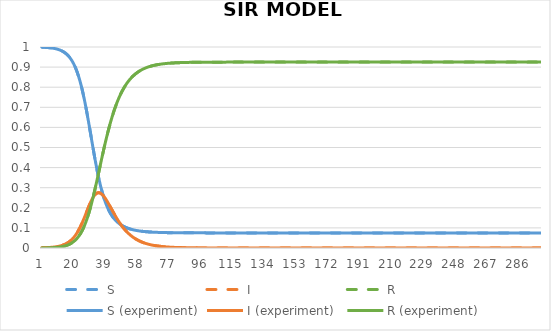
| Category | S | I  | R | S (experiment) | I (experiment) | R (experiment) |
|---|---|---|---|---|---|---|
| 0 | 0.999 | 0.001 | 0 | 0.999 | 0.001 | 0 |
| 1 | 0.999 | 0.001 | 0 | 0.999 | 0.001 | 0 |
| 2 | 0.998 | 0.002 | 0 | 0.998 | 0.002 | 0 |
| 3 | 0.998 | 0.002 | 0.001 | 0.998 | 0.002 | 0.001 |
| 4 | 0.997 | 0.002 | 0.001 | 0.997 | 0.002 | 0.001 |
| 5 | 0.996 | 0.003 | 0.001 | 0.996 | 0.003 | 0.001 |
| 6 | 0.995 | 0.004 | 0.002 | 0.995 | 0.004 | 0.002 |
| 7 | 0.994 | 0.004 | 0.002 | 0.994 | 0.004 | 0.002 |
| 8 | 0.992 | 0.005 | 0.003 | 0.992 | 0.005 | 0.003 |
| 9 | 0.99 | 0.007 | 0.003 | 0.99 | 0.007 | 0.003 |
| 10 | 0.987 | 0.008 | 0.004 | 0.987 | 0.008 | 0.004 |
| 11 | 0.984 | 0.01 | 0.006 | 0.984 | 0.01 | 0.006 |
| 12 | 0.98 | 0.013 | 0.007 | 0.98 | 0.013 | 0.007 |
| 13 | 0.976 | 0.016 | 0.009 | 0.976 | 0.016 | 0.009 |
| 14 | 0.97 | 0.019 | 0.011 | 0.97 | 0.019 | 0.011 |
| 15 | 0.963 | 0.024 | 0.014 | 0.963 | 0.024 | 0.014 |
| 16 | 0.954 | 0.029 | 0.017 | 0.954 | 0.029 | 0.017 |
| 17 | 0.944 | 0.035 | 0.021 | 0.944 | 0.035 | 0.021 |
| 18 | 0.931 | 0.043 | 0.026 | 0.931 | 0.043 | 0.026 |
| 19 | 0.916 | 0.052 | 0.032 | 0.916 | 0.052 | 0.032 |
| 20 | 0.898 | 0.063 | 0.039 | 0.898 | 0.063 | 0.039 |
| 21 | 0.877 | 0.075 | 0.048 | 0.877 | 0.075 | 0.048 |
| 22 | 0.852 | 0.089 | 0.058 | 0.852 | 0.089 | 0.058 |
| 23 | 0.824 | 0.106 | 0.071 | 0.824 | 0.106 | 0.071 |
| 24 | 0.791 | 0.124 | 0.086 | 0.791 | 0.124 | 0.086 |
| 25 | 0.754 | 0.143 | 0.103 | 0.754 | 0.143 | 0.103 |
| 26 | 0.713 | 0.164 | 0.123 | 0.713 | 0.164 | 0.123 |
| 27 | 0.669 | 0.185 | 0.146 | 0.669 | 0.185 | 0.146 |
| 28 | 0.622 | 0.206 | 0.172 | 0.622 | 0.206 | 0.172 |
| 29 | 0.573 | 0.226 | 0.201 | 0.573 | 0.226 | 0.201 |
| 30 | 0.524 | 0.243 | 0.232 | 0.524 | 0.243 | 0.232 |
| 31 | 0.476 | 0.257 | 0.267 | 0.476 | 0.257 | 0.267 |
| 32 | 0.43 | 0.268 | 0.303 | 0.43 | 0.268 | 0.303 |
| 33 | 0.386 | 0.274 | 0.34 | 0.386 | 0.274 | 0.34 |
| 34 | 0.346 | 0.275 | 0.378 | 0.346 | 0.275 | 0.378 |
| 35 | 0.31 | 0.273 | 0.417 | 0.31 | 0.273 | 0.417 |
| 36 | 0.278 | 0.267 | 0.455 | 0.278 | 0.267 | 0.455 |
| 37 | 0.25 | 0.257 | 0.492 | 0.25 | 0.257 | 0.492 |
| 38 | 0.226 | 0.246 | 0.528 | 0.226 | 0.246 | 0.528 |
| 39 | 0.205 | 0.232 | 0.563 | 0.205 | 0.232 | 0.563 |
| 40 | 0.187 | 0.218 | 0.595 | 0.187 | 0.218 | 0.595 |
| 41 | 0.172 | 0.203 | 0.626 | 0.172 | 0.203 | 0.626 |
| 42 | 0.158 | 0.187 | 0.654 | 0.158 | 0.187 | 0.654 |
| 43 | 0.147 | 0.172 | 0.68 | 0.147 | 0.172 | 0.68 |
| 44 | 0.138 | 0.158 | 0.705 | 0.138 | 0.158 | 0.705 |
| 45 | 0.129 | 0.144 | 0.727 | 0.129 | 0.144 | 0.727 |
| 46 | 0.122 | 0.131 | 0.747 | 0.122 | 0.131 | 0.747 |
| 47 | 0.116 | 0.119 | 0.765 | 0.116 | 0.119 | 0.765 |
| 48 | 0.111 | 0.107 | 0.782 | 0.111 | 0.107 | 0.782 |
| 49 | 0.107 | 0.097 | 0.797 | 0.107 | 0.097 | 0.797 |
| 50 | 0.103 | 0.087 | 0.81 | 0.103 | 0.087 | 0.81 |
| 51 | 0.099 | 0.078 | 0.822 | 0.099 | 0.078 | 0.822 |
| 52 | 0.096 | 0.07 | 0.833 | 0.096 | 0.07 | 0.833 |
| 53 | 0.094 | 0.063 | 0.843 | 0.094 | 0.063 | 0.843 |
| 54 | 0.092 | 0.056 | 0.852 | 0.092 | 0.056 | 0.852 |
| 55 | 0.09 | 0.05 | 0.86 | 0.09 | 0.05 | 0.86 |
| 56 | 0.088 | 0.045 | 0.867 | 0.088 | 0.045 | 0.867 |
| 57 | 0.086 | 0.04 | 0.873 | 0.086 | 0.04 | 0.873 |
| 58 | 0.085 | 0.036 | 0.879 | 0.085 | 0.036 | 0.879 |
| 59 | 0.084 | 0.032 | 0.884 | 0.084 | 0.032 | 0.884 |
| 60 | 0.083 | 0.029 | 0.888 | 0.083 | 0.029 | 0.888 |
| 61 | 0.082 | 0.025 | 0.892 | 0.082 | 0.025 | 0.892 |
| 62 | 0.081 | 0.023 | 0.896 | 0.081 | 0.023 | 0.896 |
| 63 | 0.081 | 0.02 | 0.899 | 0.081 | 0.02 | 0.899 |
| 64 | 0.08 | 0.018 | 0.902 | 0.08 | 0.018 | 0.902 |
| 65 | 0.079 | 0.016 | 0.905 | 0.079 | 0.016 | 0.905 |
| 66 | 0.079 | 0.014 | 0.907 | 0.079 | 0.014 | 0.907 |
| 67 | 0.078 | 0.013 | 0.909 | 0.078 | 0.013 | 0.909 |
| 68 | 0.078 | 0.011 | 0.911 | 0.078 | 0.011 | 0.911 |
| 69 | 0.078 | 0.01 | 0.912 | 0.078 | 0.01 | 0.912 |
| 70 | 0.077 | 0.009 | 0.914 | 0.077 | 0.009 | 0.914 |
| 71 | 0.077 | 0.008 | 0.915 | 0.077 | 0.008 | 0.915 |
| 72 | 0.077 | 0.007 | 0.916 | 0.077 | 0.007 | 0.916 |
| 73 | 0.077 | 0.006 | 0.917 | 0.077 | 0.006 | 0.917 |
| 74 | 0.077 | 0.006 | 0.918 | 0.077 | 0.006 | 0.918 |
| 75 | 0.076 | 0.005 | 0.919 | 0.076 | 0.005 | 0.919 |
| 76 | 0.076 | 0.004 | 0.919 | 0.076 | 0.004 | 0.919 |
| 77 | 0.076 | 0.004 | 0.92 | 0.076 | 0.004 | 0.92 |
| 78 | 0.076 | 0.003 | 0.92 | 0.076 | 0.003 | 0.92 |
| 79 | 0.076 | 0.003 | 0.921 | 0.076 | 0.003 | 0.921 |
| 80 | 0.076 | 0.003 | 0.921 | 0.076 | 0.003 | 0.921 |
| 81 | 0.076 | 0.002 | 0.922 | 0.076 | 0.002 | 0.922 |
| 82 | 0.076 | 0.002 | 0.922 | 0.076 | 0.002 | 0.922 |
| 83 | 0.076 | 0.002 | 0.922 | 0.076 | 0.002 | 0.922 |
| 84 | 0.076 | 0.002 | 0.923 | 0.076 | 0.002 | 0.923 |
| 85 | 0.076 | 0.002 | 0.923 | 0.076 | 0.002 | 0.923 |
| 86 | 0.076 | 0.001 | 0.923 | 0.076 | 0.001 | 0.923 |
| 87 | 0.075 | 0.001 | 0.923 | 0.075 | 0.001 | 0.923 |
| 88 | 0.075 | 0.001 | 0.923 | 0.075 | 0.001 | 0.923 |
| 89 | 0.075 | 0.001 | 0.924 | 0.075 | 0.001 | 0.924 |
| 90 | 0.075 | 0.001 | 0.924 | 0.075 | 0.001 | 0.924 |
| 91 | 0.075 | 0.001 | 0.924 | 0.075 | 0.001 | 0.924 |
| 92 | 0.075 | 0.001 | 0.924 | 0.075 | 0.001 | 0.924 |
| 93 | 0.075 | 0.001 | 0.924 | 0.075 | 0.001 | 0.924 |
| 94 | 0.075 | 0.001 | 0.924 | 0.075 | 0.001 | 0.924 |
| 95 | 0.075 | 0 | 0.924 | 0.075 | 0 | 0.924 |
| 96 | 0.075 | 0 | 0.924 | 0.075 | 0 | 0.924 |
| 97 | 0.075 | 0 | 0.924 | 0.075 | 0 | 0.924 |
| 98 | 0.075 | 0 | 0.924 | 0.075 | 0 | 0.924 |
| 99 | 0.075 | 0 | 0.924 | 0.075 | 0 | 0.924 |
| 100 | 0.075 | 0 | 0.925 | 0.075 | 0 | 0.925 |
| 101 | 0.075 | 0 | 0.925 | 0.075 | 0 | 0.925 |
| 102 | 0.075 | 0 | 0.925 | 0.075 | 0 | 0.925 |
| 103 | 0.075 | 0 | 0.925 | 0.075 | 0 | 0.925 |
| 104 | 0.075 | 0 | 0.925 | 0.075 | 0 | 0.925 |
| 105 | 0.075 | 0 | 0.925 | 0.075 | 0 | 0.925 |
| 106 | 0.075 | 0 | 0.925 | 0.075 | 0 | 0.925 |
| 107 | 0.075 | 0 | 0.925 | 0.075 | 0 | 0.925 |
| 108 | 0.075 | 0 | 0.925 | 0.075 | 0 | 0.925 |
| 109 | 0.075 | 0 | 0.925 | 0.075 | 0 | 0.925 |
| 110 | 0.075 | 0 | 0.925 | 0.075 | 0 | 0.925 |
| 111 | 0.075 | 0 | 0.925 | 0.075 | 0 | 0.925 |
| 112 | 0.075 | 0 | 0.925 | 0.075 | 0 | 0.925 |
| 113 | 0.075 | 0 | 0.925 | 0.075 | 0 | 0.925 |
| 114 | 0.075 | 0 | 0.925 | 0.075 | 0 | 0.925 |
| 115 | 0.075 | 0 | 0.925 | 0.075 | 0 | 0.925 |
| 116 | 0.075 | 0 | 0.925 | 0.075 | 0 | 0.925 |
| 117 | 0.075 | 0 | 0.925 | 0.075 | 0 | 0.925 |
| 118 | 0.075 | 0 | 0.925 | 0.075 | 0 | 0.925 |
| 119 | 0.075 | 0 | 0.925 | 0.075 | 0 | 0.925 |
| 120 | 0.075 | 0 | 0.925 | 0.075 | 0 | 0.925 |
| 121 | 0.075 | 0 | 0.925 | 0.075 | 0 | 0.925 |
| 122 | 0.075 | 0 | 0.925 | 0.075 | 0 | 0.925 |
| 123 | 0.075 | 0 | 0.925 | 0.075 | 0 | 0.925 |
| 124 | 0.075 | 0 | 0.925 | 0.075 | 0 | 0.925 |
| 125 | 0.075 | 0 | 0.925 | 0.075 | 0 | 0.925 |
| 126 | 0.075 | 0 | 0.925 | 0.075 | 0 | 0.925 |
| 127 | 0.075 | 0 | 0.925 | 0.075 | 0 | 0.925 |
| 128 | 0.075 | 0 | 0.925 | 0.075 | 0 | 0.925 |
| 129 | 0.075 | 0 | 0.925 | 0.075 | 0 | 0.925 |
| 130 | 0.075 | 0 | 0.925 | 0.075 | 0 | 0.925 |
| 131 | 0.075 | 0 | 0.925 | 0.075 | 0 | 0.925 |
| 132 | 0.075 | 0 | 0.925 | 0.075 | 0 | 0.925 |
| 133 | 0.075 | 0 | 0.925 | 0.075 | 0 | 0.925 |
| 134 | 0.075 | 0 | 0.925 | 0.075 | 0 | 0.925 |
| 135 | 0.075 | 0 | 0.925 | 0.075 | 0 | 0.925 |
| 136 | 0.075 | 0 | 0.925 | 0.075 | 0 | 0.925 |
| 137 | 0.075 | 0 | 0.925 | 0.075 | 0 | 0.925 |
| 138 | 0.075 | 0 | 0.925 | 0.075 | 0 | 0.925 |
| 139 | 0.075 | 0 | 0.925 | 0.075 | 0 | 0.925 |
| 140 | 0.075 | 0 | 0.925 | 0.075 | 0 | 0.925 |
| 141 | 0.075 | 0 | 0.925 | 0.075 | 0 | 0.925 |
| 142 | 0.075 | 0 | 0.925 | 0.075 | 0 | 0.925 |
| 143 | 0.075 | 0 | 0.925 | 0.075 | 0 | 0.925 |
| 144 | 0.075 | 0 | 0.925 | 0.075 | 0 | 0.925 |
| 145 | 0.075 | 0 | 0.925 | 0.075 | 0 | 0.925 |
| 146 | 0.075 | 0 | 0.925 | 0.075 | 0 | 0.925 |
| 147 | 0.075 | 0 | 0.925 | 0.075 | 0 | 0.925 |
| 148 | 0.075 | 0 | 0.925 | 0.075 | 0 | 0.925 |
| 149 | 0.075 | 0 | 0.925 | 0.075 | 0 | 0.925 |
| 150 | 0.075 | 0 | 0.925 | 0.075 | 0 | 0.925 |
| 151 | 0.075 | 0 | 0.925 | 0.075 | 0 | 0.925 |
| 152 | 0.075 | 0 | 0.925 | 0.075 | 0 | 0.925 |
| 153 | 0.075 | 0 | 0.925 | 0.075 | 0 | 0.925 |
| 154 | 0.075 | 0 | 0.925 | 0.075 | 0 | 0.925 |
| 155 | 0.075 | 0 | 0.925 | 0.075 | 0 | 0.925 |
| 156 | 0.075 | 0 | 0.925 | 0.075 | 0 | 0.925 |
| 157 | 0.075 | 0 | 0.925 | 0.075 | 0 | 0.925 |
| 158 | 0.075 | 0 | 0.925 | 0.075 | 0 | 0.925 |
| 159 | 0.075 | 0 | 0.925 | 0.075 | 0 | 0.925 |
| 160 | 0.075 | 0 | 0.925 | 0.075 | 0 | 0.925 |
| 161 | 0.075 | 0 | 0.925 | 0.075 | 0 | 0.925 |
| 162 | 0.075 | 0 | 0.925 | 0.075 | 0 | 0.925 |
| 163 | 0.075 | 0 | 0.925 | 0.075 | 0 | 0.925 |
| 164 | 0.075 | 0 | 0.925 | 0.075 | 0 | 0.925 |
| 165 | 0.075 | 0 | 0.925 | 0.075 | 0 | 0.925 |
| 166 | 0.075 | 0 | 0.925 | 0.075 | 0 | 0.925 |
| 167 | 0.075 | 0 | 0.925 | 0.075 | 0 | 0.925 |
| 168 | 0.075 | 0 | 0.925 | 0.075 | 0 | 0.925 |
| 169 | 0.075 | 0 | 0.925 | 0.075 | 0 | 0.925 |
| 170 | 0.075 | 0 | 0.925 | 0.075 | 0 | 0.925 |
| 171 | 0.075 | 0 | 0.925 | 0.075 | 0 | 0.925 |
| 172 | 0.075 | 0 | 0.925 | 0.075 | 0 | 0.925 |
| 173 | 0.075 | 0 | 0.925 | 0.075 | 0 | 0.925 |
| 174 | 0.075 | 0 | 0.925 | 0.075 | 0 | 0.925 |
| 175 | 0.075 | 0 | 0.925 | 0.075 | 0 | 0.925 |
| 176 | 0.075 | 0 | 0.925 | 0.075 | 0 | 0.925 |
| 177 | 0.075 | 0 | 0.925 | 0.075 | 0 | 0.925 |
| 178 | 0.075 | 0 | 0.925 | 0.075 | 0 | 0.925 |
| 179 | 0.075 | 0 | 0.925 | 0.075 | 0 | 0.925 |
| 180 | 0.075 | 0 | 0.925 | 0.075 | 0 | 0.925 |
| 181 | 0.075 | 0 | 0.925 | 0.075 | 0 | 0.925 |
| 182 | 0.075 | 0 | 0.925 | 0.075 | 0 | 0.925 |
| 183 | 0.075 | 0 | 0.925 | 0.075 | 0 | 0.925 |
| 184 | 0.075 | 0 | 0.925 | 0.075 | 0 | 0.925 |
| 185 | 0.075 | 0 | 0.925 | 0.075 | 0 | 0.925 |
| 186 | 0.075 | 0 | 0.925 | 0.075 | 0 | 0.925 |
| 187 | 0.075 | 0 | 0.925 | 0.075 | 0 | 0.925 |
| 188 | 0.075 | 0 | 0.925 | 0.075 | 0 | 0.925 |
| 189 | 0.075 | 0 | 0.925 | 0.075 | 0 | 0.925 |
| 190 | 0.075 | 0 | 0.925 | 0.075 | 0 | 0.925 |
| 191 | 0.075 | 0 | 0.925 | 0.075 | 0 | 0.925 |
| 192 | 0.075 | 0 | 0.925 | 0.075 | 0 | 0.925 |
| 193 | 0.075 | 0 | 0.925 | 0.075 | 0 | 0.925 |
| 194 | 0.075 | 0 | 0.925 | 0.075 | 0 | 0.925 |
| 195 | 0.075 | 0 | 0.925 | 0.075 | 0 | 0.925 |
| 196 | 0.075 | 0 | 0.925 | 0.075 | 0 | 0.925 |
| 197 | 0.075 | 0 | 0.925 | 0.075 | 0 | 0.925 |
| 198 | 0.075 | 0 | 0.925 | 0.075 | 0 | 0.925 |
| 199 | 0.075 | 0 | 0.925 | 0.075 | 0 | 0.925 |
| 200 | 0.075 | 0 | 0.925 | 0.075 | 0 | 0.925 |
| 201 | 0.075 | 0 | 0.925 | 0.075 | 0 | 0.925 |
| 202 | 0.075 | 0 | 0.925 | 0.075 | 0 | 0.925 |
| 203 | 0.075 | 0 | 0.925 | 0.075 | 0 | 0.925 |
| 204 | 0.075 | 0 | 0.925 | 0.075 | 0 | 0.925 |
| 205 | 0.075 | 0 | 0.925 | 0.075 | 0 | 0.925 |
| 206 | 0.075 | 0 | 0.925 | 0.075 | 0 | 0.925 |
| 207 | 0.075 | 0 | 0.925 | 0.075 | 0 | 0.925 |
| 208 | 0.075 | 0 | 0.925 | 0.075 | 0 | 0.925 |
| 209 | 0.075 | 0 | 0.925 | 0.075 | 0 | 0.925 |
| 210 | 0.075 | 0 | 0.925 | 0.075 | 0 | 0.925 |
| 211 | 0.075 | 0 | 0.925 | 0.075 | 0 | 0.925 |
| 212 | 0.075 | 0 | 0.925 | 0.075 | 0 | 0.925 |
| 213 | 0.075 | 0 | 0.925 | 0.075 | 0 | 0.925 |
| 214 | 0.075 | 0 | 0.925 | 0.075 | 0 | 0.925 |
| 215 | 0.075 | 0 | 0.925 | 0.075 | 0 | 0.925 |
| 216 | 0.075 | 0 | 0.925 | 0.075 | 0 | 0.925 |
| 217 | 0.075 | 0 | 0.925 | 0.075 | 0 | 0.925 |
| 218 | 0.075 | 0 | 0.925 | 0.075 | 0 | 0.925 |
| 219 | 0.075 | 0 | 0.925 | 0.075 | 0 | 0.925 |
| 220 | 0.075 | 0 | 0.925 | 0.075 | 0 | 0.925 |
| 221 | 0.075 | 0 | 0.925 | 0.075 | 0 | 0.925 |
| 222 | 0.075 | 0 | 0.925 | 0.075 | 0 | 0.925 |
| 223 | 0.075 | 0 | 0.925 | 0.075 | 0 | 0.925 |
| 224 | 0.075 | 0 | 0.925 | 0.075 | 0 | 0.925 |
| 225 | 0.075 | 0 | 0.925 | 0.075 | 0 | 0.925 |
| 226 | 0.075 | 0 | 0.925 | 0.075 | 0 | 0.925 |
| 227 | 0.075 | 0 | 0.925 | 0.075 | 0 | 0.925 |
| 228 | 0.075 | 0 | 0.925 | 0.075 | 0 | 0.925 |
| 229 | 0.075 | 0 | 0.925 | 0.075 | 0 | 0.925 |
| 230 | 0.075 | 0 | 0.925 | 0.075 | 0 | 0.925 |
| 231 | 0.075 | 0 | 0.925 | 0.075 | 0 | 0.925 |
| 232 | 0.075 | 0 | 0.925 | 0.075 | 0 | 0.925 |
| 233 | 0.075 | 0 | 0.925 | 0.075 | 0 | 0.925 |
| 234 | 0.075 | 0 | 0.925 | 0.075 | 0 | 0.925 |
| 235 | 0.075 | 0 | 0.925 | 0.075 | 0 | 0.925 |
| 236 | 0.075 | 0 | 0.925 | 0.075 | 0 | 0.925 |
| 237 | 0.075 | 0 | 0.925 | 0.075 | 0 | 0.925 |
| 238 | 0.075 | 0 | 0.925 | 0.075 | 0 | 0.925 |
| 239 | 0.075 | 0 | 0.925 | 0.075 | 0 | 0.925 |
| 240 | 0.075 | 0 | 0.925 | 0.075 | 0 | 0.925 |
| 241 | 0.075 | 0 | 0.925 | 0.075 | 0 | 0.925 |
| 242 | 0.075 | 0 | 0.925 | 0.075 | 0 | 0.925 |
| 243 | 0.075 | 0 | 0.925 | 0.075 | 0 | 0.925 |
| 244 | 0.075 | 0 | 0.925 | 0.075 | 0 | 0.925 |
| 245 | 0.075 | 0 | 0.925 | 0.075 | 0 | 0.925 |
| 246 | 0.075 | 0 | 0.925 | 0.075 | 0 | 0.925 |
| 247 | 0.075 | 0 | 0.925 | 0.075 | 0 | 0.925 |
| 248 | 0.075 | 0 | 0.925 | 0.075 | 0 | 0.925 |
| 249 | 0.075 | 0 | 0.925 | 0.075 | 0 | 0.925 |
| 250 | 0.075 | 0 | 0.925 | 0.075 | 0 | 0.925 |
| 251 | 0.075 | 0 | 0.925 | 0.075 | 0 | 0.925 |
| 252 | 0.075 | 0 | 0.925 | 0.075 | 0 | 0.925 |
| 253 | 0.075 | 0 | 0.925 | 0.075 | 0 | 0.925 |
| 254 | 0.075 | 0 | 0.925 | 0.075 | 0 | 0.925 |
| 255 | 0.075 | 0 | 0.925 | 0.075 | 0 | 0.925 |
| 256 | 0.075 | 0 | 0.925 | 0.075 | 0 | 0.925 |
| 257 | 0.075 | 0 | 0.925 | 0.075 | 0 | 0.925 |
| 258 | 0.075 | 0 | 0.925 | 0.075 | 0 | 0.925 |
| 259 | 0.075 | 0 | 0.925 | 0.075 | 0 | 0.925 |
| 260 | 0.075 | 0 | 0.925 | 0.075 | 0 | 0.925 |
| 261 | 0.075 | 0 | 0.925 | 0.075 | 0 | 0.925 |
| 262 | 0.075 | 0 | 0.925 | 0.075 | 0 | 0.925 |
| 263 | 0.075 | 0 | 0.925 | 0.075 | 0 | 0.925 |
| 264 | 0.075 | 0 | 0.925 | 0.075 | 0 | 0.925 |
| 265 | 0.075 | 0 | 0.925 | 0.075 | 0 | 0.925 |
| 266 | 0.075 | 0 | 0.925 | 0.075 | 0 | 0.925 |
| 267 | 0.075 | 0 | 0.925 | 0.075 | 0 | 0.925 |
| 268 | 0.075 | 0 | 0.925 | 0.075 | 0 | 0.925 |
| 269 | 0.075 | 0 | 0.925 | 0.075 | 0 | 0.925 |
| 270 | 0.075 | 0 | 0.925 | 0.075 | 0 | 0.925 |
| 271 | 0.075 | 0 | 0.925 | 0.075 | 0 | 0.925 |
| 272 | 0.075 | 0 | 0.925 | 0.075 | 0 | 0.925 |
| 273 | 0.075 | 0 | 0.925 | 0.075 | 0 | 0.925 |
| 274 | 0.075 | 0 | 0.925 | 0.075 | 0 | 0.925 |
| 275 | 0.075 | 0 | 0.925 | 0.075 | 0 | 0.925 |
| 276 | 0.075 | 0 | 0.925 | 0.075 | 0 | 0.925 |
| 277 | 0.075 | 0 | 0.925 | 0.075 | 0 | 0.925 |
| 278 | 0.075 | 0 | 0.925 | 0.075 | 0 | 0.925 |
| 279 | 0.075 | 0 | 0.925 | 0.075 | 0 | 0.925 |
| 280 | 0.075 | 0 | 0.925 | 0.075 | 0 | 0.925 |
| 281 | 0.075 | 0 | 0.925 | 0.075 | 0 | 0.925 |
| 282 | 0.075 | 0 | 0.925 | 0.075 | 0 | 0.925 |
| 283 | 0.075 | 0 | 0.925 | 0.075 | 0 | 0.925 |
| 284 | 0.075 | 0 | 0.925 | 0.075 | 0 | 0.925 |
| 285 | 0.075 | 0 | 0.925 | 0.075 | 0 | 0.925 |
| 286 | 0.075 | 0 | 0.925 | 0.075 | 0 | 0.925 |
| 287 | 0.075 | 0 | 0.925 | 0.075 | 0 | 0.925 |
| 288 | 0.075 | 0 | 0.925 | 0.075 | 0 | 0.925 |
| 289 | 0.075 | 0 | 0.925 | 0.075 | 0 | 0.925 |
| 290 | 0.075 | 0 | 0.925 | 0.075 | 0 | 0.925 |
| 291 | 0.075 | 0 | 0.925 | 0.075 | 0 | 0.925 |
| 292 | 0.075 | 0 | 0.925 | 0.075 | 0 | 0.925 |
| 293 | 0.075 | 0 | 0.925 | 0.075 | 0 | 0.925 |
| 294 | 0.075 | 0 | 0.925 | 0.075 | 0 | 0.925 |
| 295 | 0.075 | 0 | 0.925 | 0.075 | 0 | 0.925 |
| 296 | 0.075 | 0 | 0.925 | 0.075 | 0 | 0.925 |
| 297 | 0.075 | 0 | 0.925 | 0.075 | 0 | 0.925 |
| 298 | 0.075 | 0 | 0.925 | 0.075 | 0 | 0.925 |